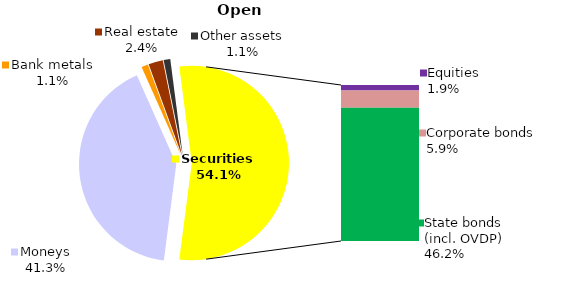
| Category | Open |
|---|---|
| Moneys | 364.534 |
| Bank metals | 9.746 |
| Real estate | 21.155 |
| Other assets | 9.76 |
| Equities | 17.164 |
| Corporate bonds | 52.524 |
| Municipal bonds | 0 |
| State bonds (incl. OVDP) | 407.884 |